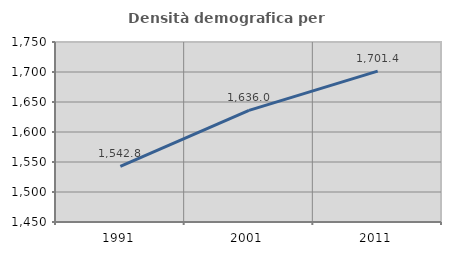
| Category | Densità demografica |
|---|---|
| 1991.0 | 1542.77 |
| 2001.0 | 1635.98 |
| 2011.0 | 1701.394 |